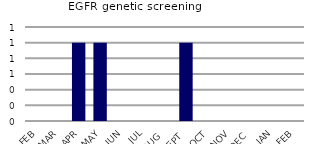
| Category | EGFR genetic screening |
|---|---|
| FEB | 0 |
| MAR | 0 |
| APR | 1 |
| MAY | 1 |
| JUN | 0 |
| JUL | 0 |
| AUG | 0 |
| SEPT | 1 |
| OCT | 0 |
| NOV | 0 |
| DEC | 0 |
| JAN | 0 |
| FEB | 0 |